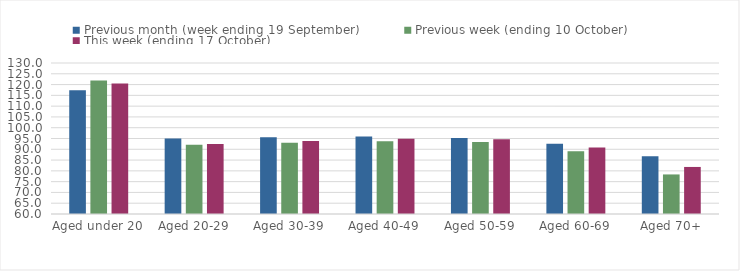
| Category | Previous month (week ending 19 September) | Previous week (ending 10 October) | This week (ending 17 October) |
|---|---|---|---|
| Aged under 20 | 117.35 | 121.93 | 120.53 |
| Aged 20-29 | 95.01 | 92.06 | 92.44 |
| Aged 30-39 | 95.57 | 93.05 | 93.87 |
| Aged 40-49 | 95.93 | 93.77 | 94.85 |
| Aged 50-59 | 95.27 | 93.43 | 94.67 |
| Aged 60-69 | 92.58 | 89.13 | 90.88 |
| Aged 70+ | 86.78 | 78.34 | 81.81 |